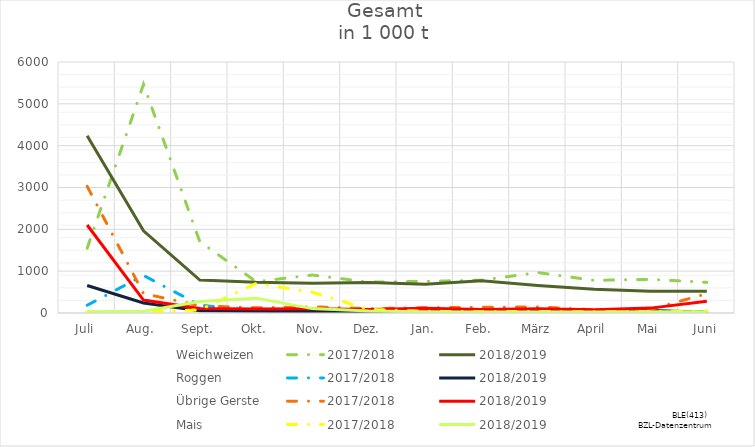
| Category | Weichweizen | 2017/2018 | 2018/2019 | Roggen | Übrige Gerste | Mais |
|---|---|---|---|---|---|---|
| Juli |  | 36.552 | 31.49 |  |  |  |
| Aug. |  | 28.978 | 41.781 |  |  |  |
| Sept. |  | 75.109 | 275.389 |  |  |  |
| Okt. |  | 707.605 | 355.031 |  |  |  |
| Nov. |  | 496.529 | 105.065 |  |  |  |
| Dez. |  | 86.598 | 49.172 |  |  |  |
| Jan. |  | 42.02 | 28.81 |  |  |  |
| Feb. |  | 31.39 | 25.583 |  |  |  |
| März |  | 35.666 | 24.702 |  |  |  |
| April |  | 27.848 | 23.055 |  |  |  |
| Mai |  | 37.486 | 29.219 |  |  |  |
| Juni |  | 47.46 | 30.119 |  |  |  |